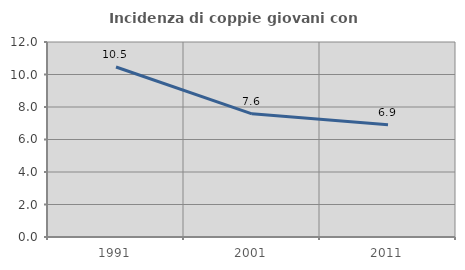
| Category | Incidenza di coppie giovani con figli |
|---|---|
| 1991.0 | 10.461 |
| 2001.0 | 7.579 |
| 2011.0 | 6.91 |